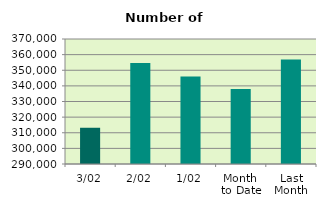
| Category | Series 0 |
|---|---|
| 3/02 | 313194 |
| 2/02 | 354720 |
| 1/02 | 346044 |
| Month 
to Date | 337986 |
| Last
Month | 356827.619 |